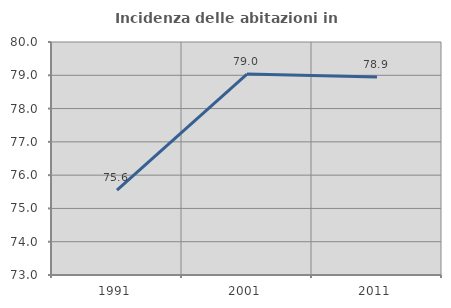
| Category | Incidenza delle abitazioni in proprietà  |
|---|---|
| 1991.0 | 75.552 |
| 2001.0 | 79.038 |
| 2011.0 | 78.947 |